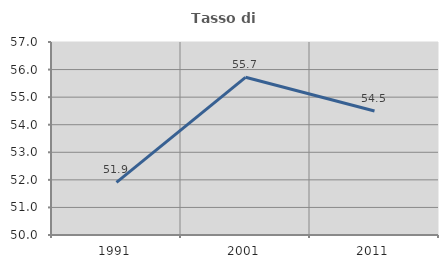
| Category | Tasso di occupazione   |
|---|---|
| 1991.0 | 51.911 |
| 2001.0 | 55.719 |
| 2011.0 | 54.498 |